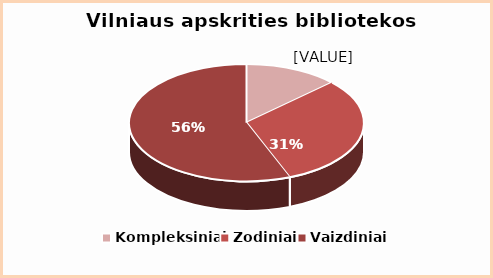
| Category | Series 0 |
|---|---|
| Kompleksiniai | 0.13 |
| Žodiniai | 0.31 |
| Vaizdiniai | 0.56 |